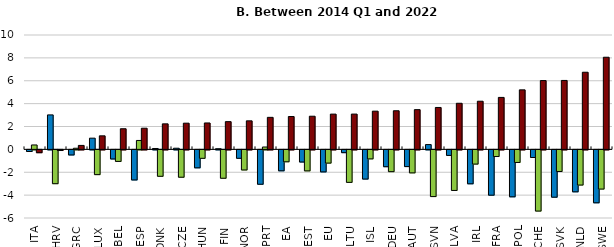
| Category | Low skilled | Middle skilled | High skilled |
|---|---|---|---|
| ITA | -0.14 | 0.386 | -0.246 |
| HRV | 3.014 | -2.957 | -0.057 |
| GRC | -0.445 | 0.099 | 0.346 |
| LUX | 0.98 | -2.164 | 1.184 |
| BEL | -0.796 | -1.009 | 1.805 |
| ESP | -2.631 | 0.78 | 1.851 |
| DNK | 0.077 | -2.309 | 2.232 |
| CZE | 0.1 | -2.391 | 2.291 |
| HUN | -1.57 | -0.739 | 2.309 |
| FIN | 0.057 | -2.482 | 2.425 |
| NOR | -0.737 | -1.758 | 2.495 |
| PRT | -3.006 | 0.207 | 2.799 |
| EA | -1.831 | -1.042 | 2.873 |
| EST | -1.061 | -1.837 | 2.898 |
| EU | -1.926 | -1.157 | 3.082 |
| LTU | -0.244 | -2.841 | 3.085 |
| ISL | -2.552 | -0.789 | 3.341 |
| DEU | -1.472 | -1.905 | 3.376 |
| AUT | -1.461 | -2.012 | 3.473 |
| SVN | 0.419 | -4.083 | 3.664 |
| LVA | -0.484 | -3.547 | 4.031 |
| IRL | -2.967 | -1.243 | 4.21 |
| FRA | -3.962 | -0.582 | 4.543 |
| POL | -4.105 | -1.1 | 5.205 |
| CHE | -0.666 | -5.35 | 6.016 |
| SVK | -4.137 | -1.89 | 6.026 |
| NLD | -3.668 | -3.076 | 6.744 |
| SWE | -4.628 | -3.427 | 8.055 |